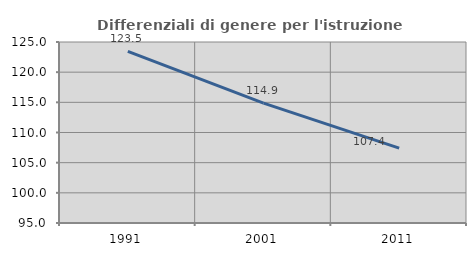
| Category | Differenziali di genere per l'istruzione superiore |
|---|---|
| 1991.0 | 123.454 |
| 2001.0 | 114.879 |
| 2011.0 | 107.399 |